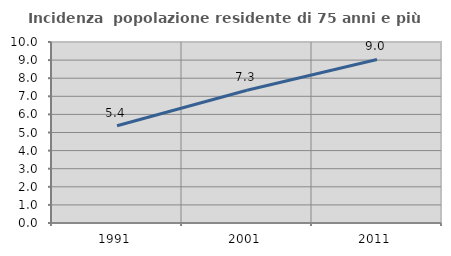
| Category | Incidenza  popolazione residente di 75 anni e più |
|---|---|
| 1991.0 | 5.372 |
| 2001.0 | 7.333 |
| 2011.0 | 9.037 |